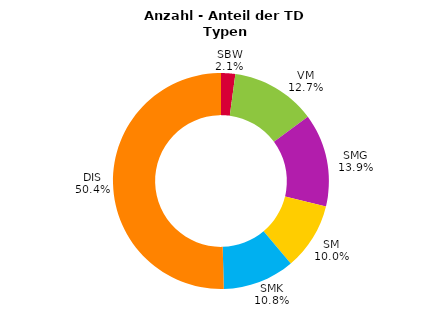
| Category | Series 0 |
|---|---|
| SBW | 0.021 |
| VM | 0.127 |
| SMG | 0.139 |
| SM | 0.1 |
| SMK | 0.108 |
| DIS | 0.504 |